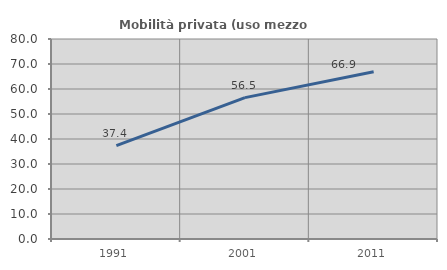
| Category | Mobilità privata (uso mezzo privato) |
|---|---|
| 1991.0 | 37.379 |
| 2001.0 | 56.548 |
| 2011.0 | 66.883 |